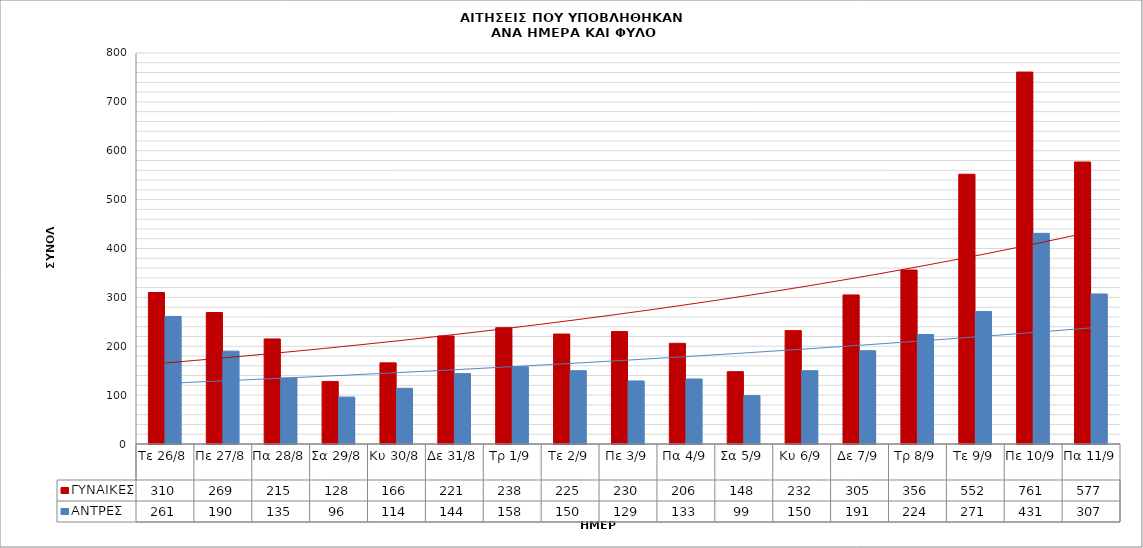
| Category | ΓΥΝΑΙΚΕΣ | ΑΝΤΡΕΣ |
|---|---|---|
| Τε 26/8 | 310 | 261 |
| Πε 27/8 | 269 | 190 |
| Πα 28/8 | 215 | 135 |
| Σα 29/8 | 128 | 96 |
| Κυ 30/8 | 166 | 114 |
| Δε 31/8 | 221 | 144 |
| Τρ 1/9 | 238 | 158 |
| Τε 2/9 | 225 | 150 |
| Πε 3/9 | 230 | 129 |
| Πα 4/9 | 206 | 133 |
| Σα 5/9 | 148 | 99 |
| Κυ 6/9 | 232 | 150 |
| Δε 7/9 | 305 | 191 |
| Τρ 8/9 | 356 | 224 |
| Τε 9/9 | 552 | 271 |
| Πε 10/9 | 761 | 431 |
| Πα 11/9 | 577 | 307 |